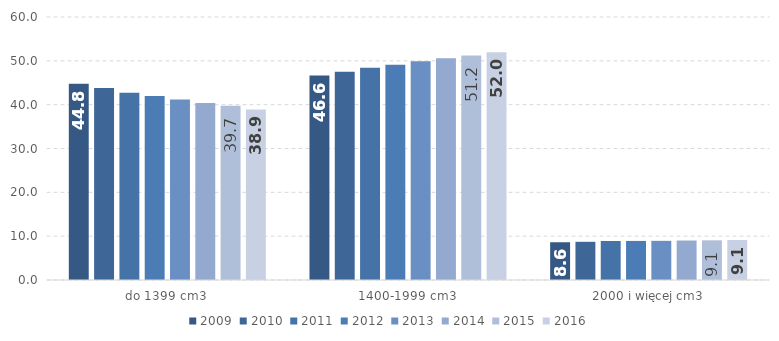
| Category | 2009 | 2010 | 2011 | 2012 | 2013 | 2014 | 2015 | 2016 |
|---|---|---|---|---|---|---|---|---|
| do 1399 cm3 | 44.753 | 43.779 | 42.691 | 41.999 | 41.184 | 40.406 | 39.729 | 38.922 |
| 1400-1999 cm3 | 46.631 | 47.508 | 48.411 | 49.085 | 49.885 | 50.591 | 51.22 | 51.956 |
| 2000 i więcej cm3 | 8.616 | 8.713 | 8.898 | 8.916 | 8.931 | 9.004 | 9.051 | 9.122 |